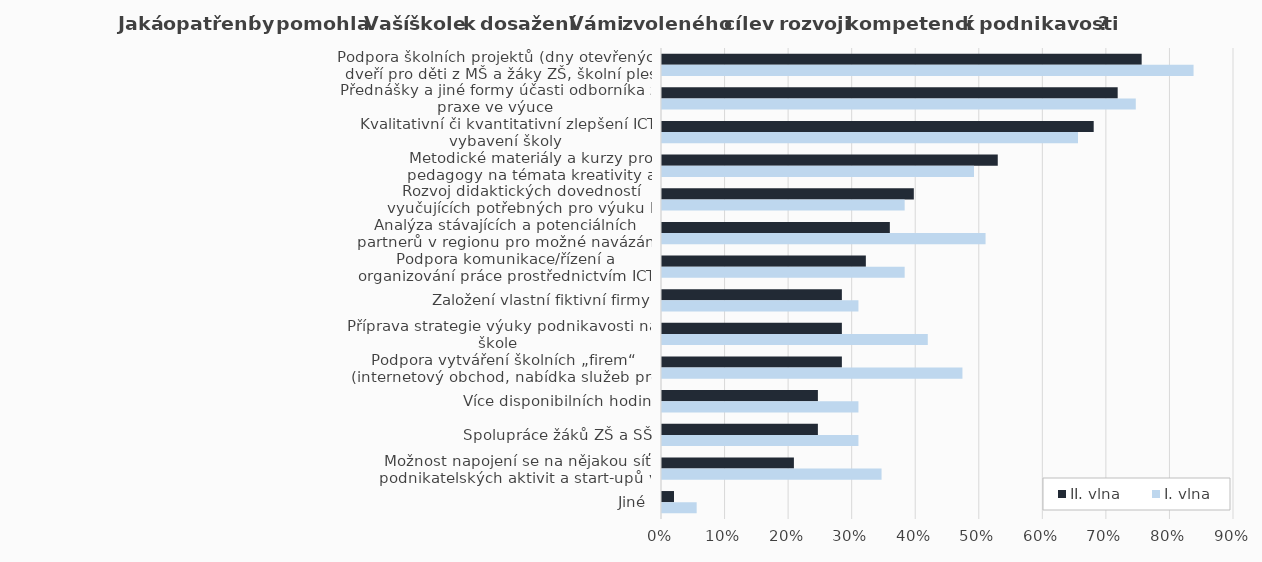
| Category | II. vlna | I. vlna |
|---|---|---|
| Podpora školních projektů (dny otevřených dveří pro děti z MŠ a žáky ZŠ, školní ples apod.) | 0.755 | 0.836 |
| Přednášky a jiné formy účasti odborníka z praxe ve výuce | 0.717 | 0.745 |
| Kvalitativní či kvantitativní zlepšení ICT vybavení školy | 0.679 | 0.655 |
| Metodické materiály a kurzy pro pedagogy na témata kreativity a podnikavosti | 0.528 | 0.491 |
| Rozvoj didaktických dovedností vyučujících potřebných pro výuku k podnikavosti | 0.396 | 0.382 |
| Analýza stávajících a potenciálních partnerů v regionu pro možné navázání spolupráce | 0.358 | 0.509 |
| Podpora komunikace/řízení a organizování práce prostřednictvím ICT | 0.321 | 0.382 |
| Založení vlastní fiktivní firmy | 0.283 | 0.309 |
| Příprava strategie výuky podnikavosti na škole | 0.283 | 0.418 |
| Podpora vytváření školních „firem“ (internetový obchod, nabídka služeb pro veřejnost apod.) | 0.283 | 0.473 |
| Více disponibilních hodin | 0.245 | 0.309 |
| Spolupráce žáků ZŠ a SŠ | 0.245 | 0.309 |
| Možnost napojení se na nějakou síť podnikatelských aktivit a start-upů v regionu | 0.208 | 0.345 |
| Jiné | 0.019 | 0.055 |